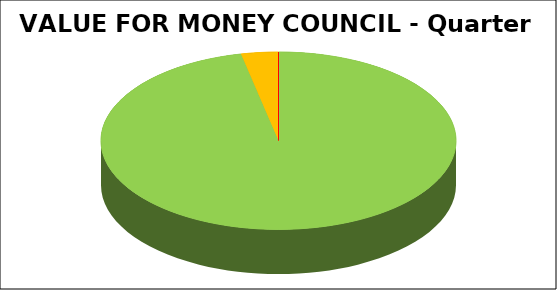
| Category | Series 0 |
|---|---|
| Green | 0.966 |
| Amber | 0.034 |
| Red | 0 |